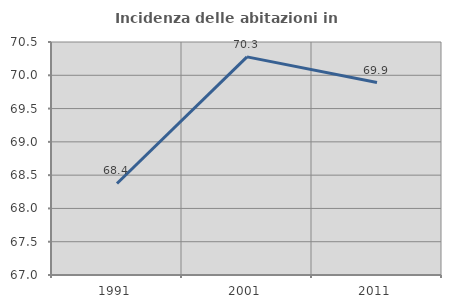
| Category | Incidenza delle abitazioni in proprietà  |
|---|---|
| 1991.0 | 68.375 |
| 2001.0 | 70.276 |
| 2011.0 | 69.891 |